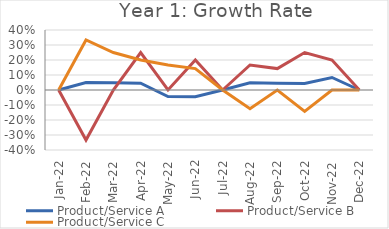
| Category | Product/Service A | Product/Service B | Product/Service C |
|---|---|---|---|
| 2022-01-16 | 0 | 0 | 0 |
| 2022-02-16 | 0.05 | -0.333 | 0.333 |
| 2022-03-16 | 0.048 | 0 | 0.25 |
| 2022-04-16 | 0.045 | 0.25 | 0.2 |
| 2022-05-16 | -0.043 | 0 | 0.167 |
| 2022-06-16 | -0.045 | 0.2 | 0.143 |
| 2022-07-16 | 0 | 0 | 0 |
| 2022-08-16 | 0.048 | 0.167 | -0.125 |
| 2022-09-16 | 0.045 | 0.143 | 0 |
| 2022-10-16 | 0.043 | 0.25 | -0.143 |
| 2022-11-16 | 0.083 | 0.2 | 0 |
| 2022-12-16 | 0 | 0 | 0 |